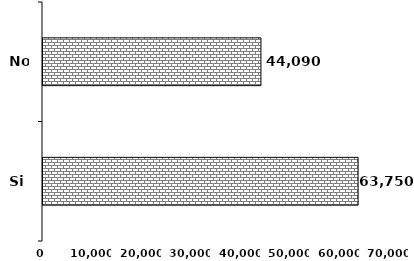
| Category | Series 0 |
|---|---|
| Si | 63750 |
| No | 44090 |